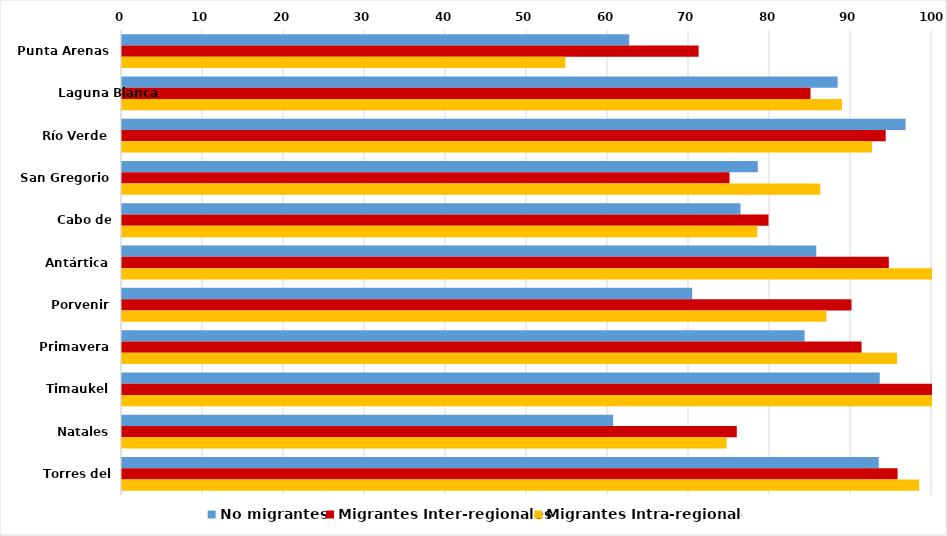
| Category | No migrantes | Migrantes Inter-regionales | Migrantes Intra-regionales |
|---|---|---|---|
| Punta Arenas | 62.614 | 71.188 | 54.739 |
| Laguna Blanca | 88.35 | 85 | 88.889 |
| Río Verde | 96.739 | 94.286 | 92.593 |
| San Gregorio | 78.495 | 75 | 86.207 |
| Cabo de Hornos | 76.36 | 79.817 | 78.431 |
| Antártica | 85.714 | 94.667 | 100 |
| Porvenir | 70.393 | 90.062 | 86.965 |
| Primavera | 84.274 | 91.304 | 95.683 |
| Timaukel | 93.548 | 100 | 100 |
| Natales | 60.634 | 75.897 | 74.658 |
| Torres del Paine | 93.427 | 95.753 | 98.413 |